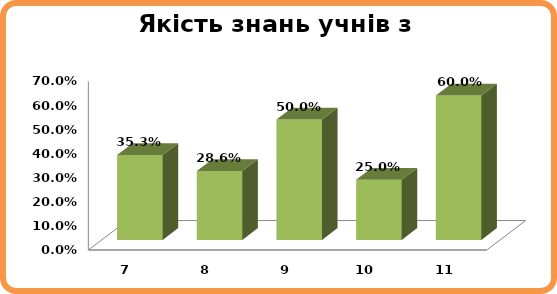
| Category | Series 0 |
|---|---|
| 7.0 | 0.353 |
| 8.0 | 0.286 |
| 9.0 | 0.5 |
| 10.0 | 0.25 |
| 11.0 | 0.6 |